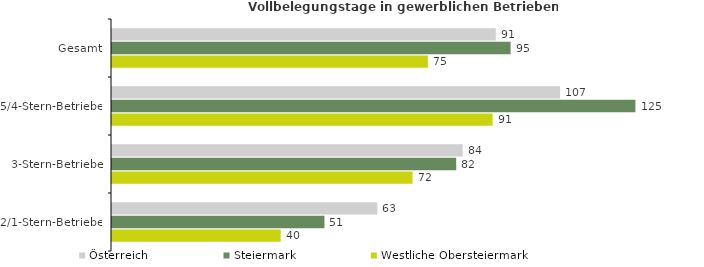
| Category | Österreich | Steiermark | Westliche Obersteiermark |
|---|---|---|---|
| Gesamt | 91.375 | 94.907 | 75.208 |
| 5/4-Stern-Betriebe | 106.695 | 124.622 | 90.616 |
| 3-Stern-Betriebe | 83.508 | 81.957 | 71.565 |
| 2/1-Stern-Betriebe | 63.173 | 50.58 | 40.156 |